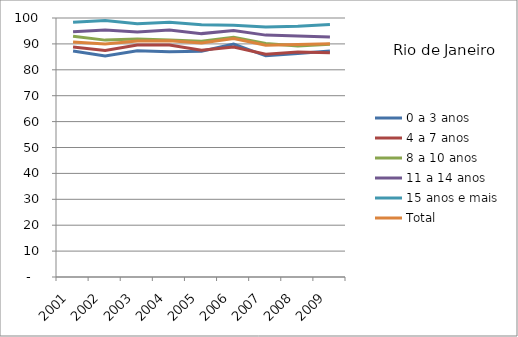
| Category | 0 a 3 anos | 4 a 7 anos | 8 a 10 anos | 11 a 14 anos | 15 anos e mais | Total |
|---|---|---|---|---|---|---|
| 2001.0 | 87.28 | 88.76 | 92.94 | 94.72 | 98.34 | 90.76 |
| 2002.0 | 85.38 | 87.46 | 91.46 | 95.41 | 99.01 | 89.98 |
| 2003.0 | 87.38 | 89.57 | 91.91 | 94.6 | 97.81 | 91.08 |
| 2004.0 | 87 | 89.6 | 91.46 | 95.33 | 98.39 | 91.17 |
| 2005.0 | 87.18 | 87.53 | 91.01 | 93.97 | 97.35 | 90.35 |
| 2006.0 | 89.93 | 88.78 | 92.6 | 95.14 | 97.18 | 92.07 |
| 2007.0 | 85.39 | 85.97 | 90.13 | 93.39 | 96.48 | 89.47 |
| 2008.0 | 86.28 | 86.84 | 89.22 | 93.09 | 96.77 | 89.75 |
| 2009.0 | 87.23 | 86.54 | 89.87 | 92.63 | 97.48 | 90.02 |